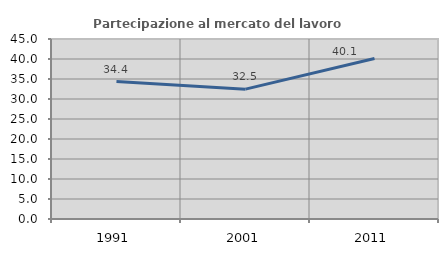
| Category | Partecipazione al mercato del lavoro  femminile |
|---|---|
| 1991.0 | 34.369 |
| 2001.0 | 32.463 |
| 2011.0 | 40.108 |